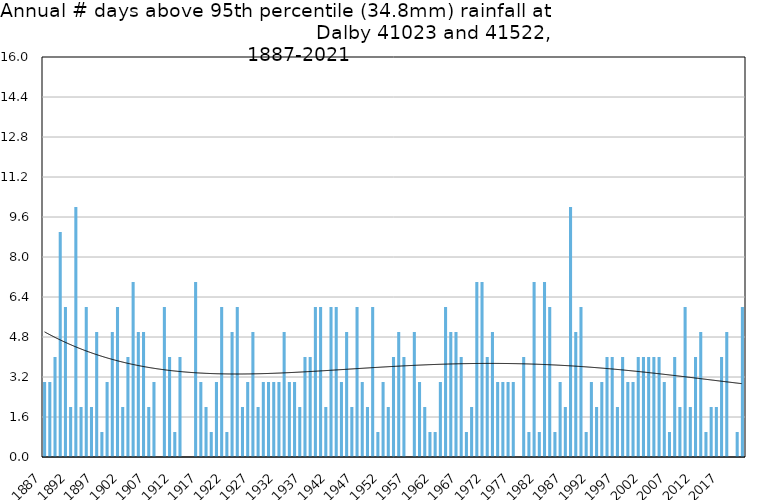
| Category | Annual # days above 95th percentile |
|---|---|
| 1887 | 3 |
| 1888 | 3 |
| 1889 | 4 |
| 1890 | 9 |
| 1891 | 6 |
| 1892 | 2 |
| 1893 | 10 |
| 1894 | 2 |
| 1895 | 6 |
| 1896 | 2 |
| 1897 | 5 |
| 1898 | 1 |
| 1899 | 3 |
| 1900 | 5 |
| 1901 | 6 |
| 1902 | 2 |
| 1903 | 4 |
| 1904 | 7 |
| 1905 | 5 |
| 1906 | 5 |
| 1907 | 2 |
| 1908 | 3 |
| 1909 | 0 |
| 1910 | 6 |
| 1911 | 4 |
| 1912 | 1 |
| 1913 | 4 |
| 1914 | 0 |
| 1915 | 0 |
| 1916 | 7 |
| 1917 | 3 |
| 1918 | 2 |
| 1919 | 1 |
| 1920 | 3 |
| 1921 | 6 |
| 1922 | 1 |
| 1923 | 5 |
| 1924 | 6 |
| 1925 | 2 |
| 1926 | 3 |
| 1927 | 5 |
| 1928 | 2 |
| 1929 | 3 |
| 1930 | 3 |
| 1931 | 3 |
| 1932 | 3 |
| 1933 | 5 |
| 1934 | 3 |
| 1935 | 3 |
| 1936 | 2 |
| 1937 | 4 |
| 1938 | 4 |
| 1939 | 6 |
| 1940 | 6 |
| 1941 | 2 |
| 1942 | 6 |
| 1943 | 6 |
| 1944 | 3 |
| 1945 | 5 |
| 1946 | 2 |
| 1947 | 6 |
| 1948 | 3 |
| 1949 | 2 |
| 1950 | 6 |
| 1951 | 1 |
| 1952 | 3 |
| 1953 | 2 |
| 1954 | 4 |
| 1955 | 5 |
| 1956 | 4 |
| 1957 | 0 |
| 1958 | 5 |
| 1959 | 3 |
| 1960 | 2 |
| 1961 | 1 |
| 1962 | 1 |
| 1963 | 3 |
| 1964 | 6 |
| 1965 | 5 |
| 1966 | 5 |
| 1967 | 4 |
| 1968 | 1 |
| 1969 | 2 |
| 1970 | 7 |
| 1971 | 7 |
| 1972 | 4 |
| 1973 | 5 |
| 1974 | 3 |
| 1975 | 3 |
| 1976 | 3 |
| 1977 | 3 |
| 1978 | 0 |
| 1979 | 4 |
| 1980 | 1 |
| 1981 | 7 |
| 1982 | 1 |
| 1983 | 7 |
| 1984 | 6 |
| 1985 | 1 |
| 1986 | 3 |
| 1987 | 2 |
| 1988 | 10 |
| 1989 | 5 |
| 1990 | 6 |
| 1991 | 1 |
| 1992 | 3 |
| 1993 | 2 |
| 1994 | 3 |
| 1995 | 4 |
| 1996 | 4 |
| 1997 | 2 |
| 1998 | 4 |
| 1999 | 3 |
| 2000 | 3 |
| 2001 | 4 |
| 2002 | 4 |
| 2003 | 4 |
| 2004 | 4 |
| 2005 | 4 |
| 2006 | 3 |
| 2007 | 1 |
| 2008 | 4 |
| 2009 | 2 |
| 2010 | 6 |
| 2011 | 2 |
| 2012 | 4 |
| 2013 | 5 |
| 2014 | 1 |
| 2015 | 2 |
| 2016 | 2 |
| 2017 | 4 |
| 2018 | 5 |
| 2019 | 0 |
| 2020 | 1 |
| 2021 | 6 |